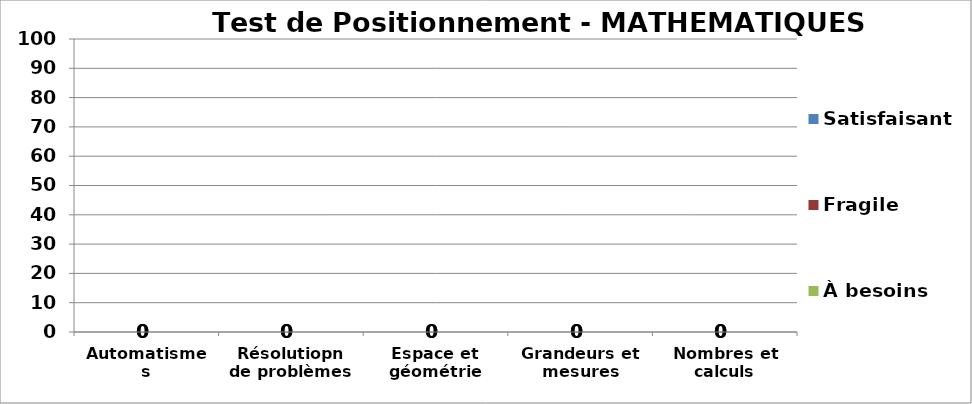
| Category | À besoins | Fragile | Satisfaisant |
|---|---|---|---|
| Automatismes | 0 | 0 | 0 |
| Résolutiopn de problèmes | 0 | 0 | 0 |
| Espace et géométrie | 0 | 0 | 0 |
| Grandeurs et mesures | 0 | 0 | 0 |
| Nombres et calculs | 0 | 0 | 0 |